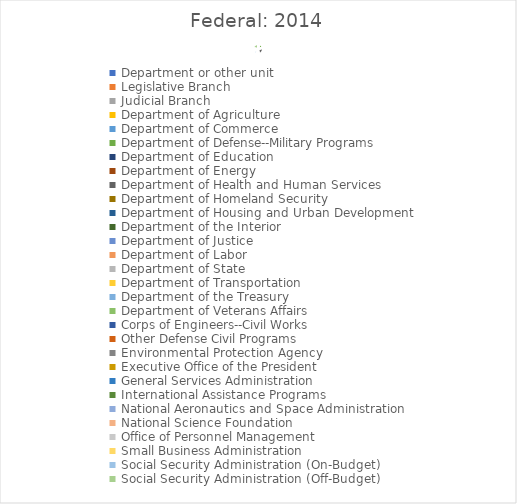
| Category | Series 0 |
|---|---|
| Department or other unit | 2014 |
| Legislative Branch | 4164 |
| Judicial Branch | 6893 |
| Department of Agriculture | 141808 |
| Department of Commerce | 7895 |
| Department of Defense--Military Programs | 577898 |
| Department of Education | 59610 |
| Department of Energy | 23638 |
| Department of Health and Human Services | 936012 |
| Department of Homeland Security | 43263 |
| Department of Housing and Urban Development | 38527 |
| Department of the Interior | 11279 |
| Department of Justice | 28620 |
| Department of Labor | 56774 |
| Department of State | 27483 |
| Department of Transportation | 76174 |
| Department of the Treasury | 446897 |
| Department of Veterans Affairs | 149074 |
| Corps of Engineers--Civil Works | 6535 |
| Other Defense Civil Programs | 57370 |
| Environmental Protection Agency | 9399 |
| Executive Office of the President | 375 |
| General Services Administration | -767 |
| International Assistance Programs | 18740 |
| National Aeronautics and Space Administration | 17095 |
| National Science Foundation | 7053 |
| Office of Personnel Management | 87917 |
| Small Business Administration | 194 |
| Social Security Administration (On-Budget) | 81184 |
| Social Security Administration (Off-Budget) | 824587 |